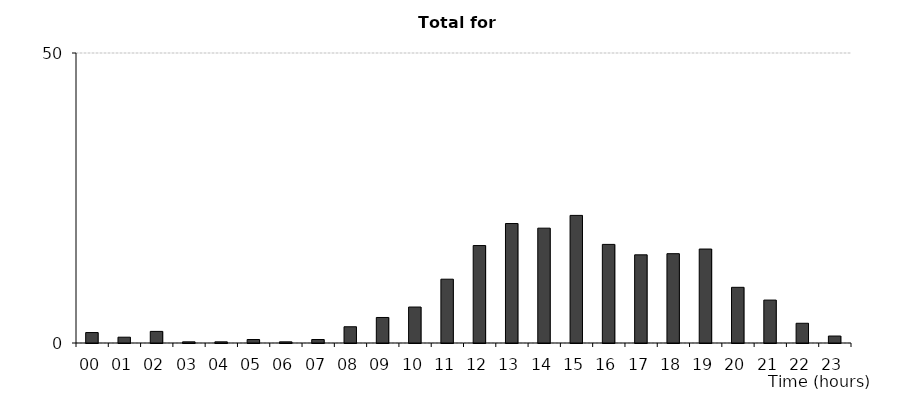
| Category | Series 2 |
|---|---|
| 00 | 1.8 |
| 01 | 1 |
| 02 | 2 |
| 03 | 0.2 |
| 04 | 0.2 |
| 05 | 0.6 |
| 06 | 0.2 |
| 07 | 0.6 |
| 08 | 2.8 |
| 09 | 4.4 |
| 10 | 6.2 |
| 11 | 11 |
| 12 | 16.8 |
| 13 | 20.6 |
| 14 | 19.8 |
| 15 | 22 |
| 16 | 17 |
| 17 | 15.2 |
| 18 | 15.4 |
| 19 | 16.2 |
| 20 | 9.6 |
| 21 | 7.4 |
| 22 | 3.4 |
| 23 | 1.2 |